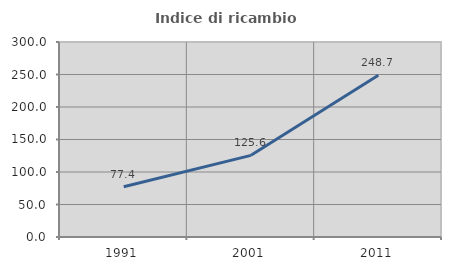
| Category | Indice di ricambio occupazionale  |
|---|---|
| 1991.0 | 77.419 |
| 2001.0 | 125.644 |
| 2011.0 | 248.747 |